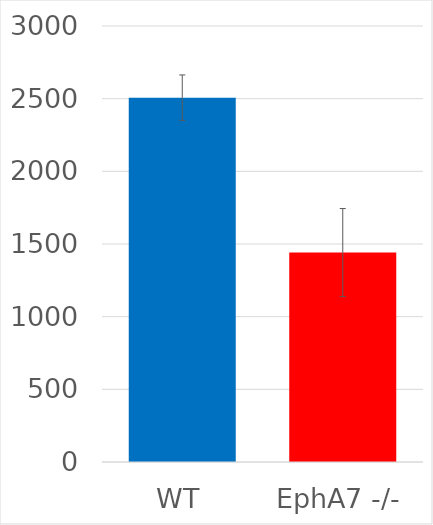
| Category | WT EphA7 -/- |
|---|---|
| WT | 2507 |
| EphA7 -/- | 1441 |